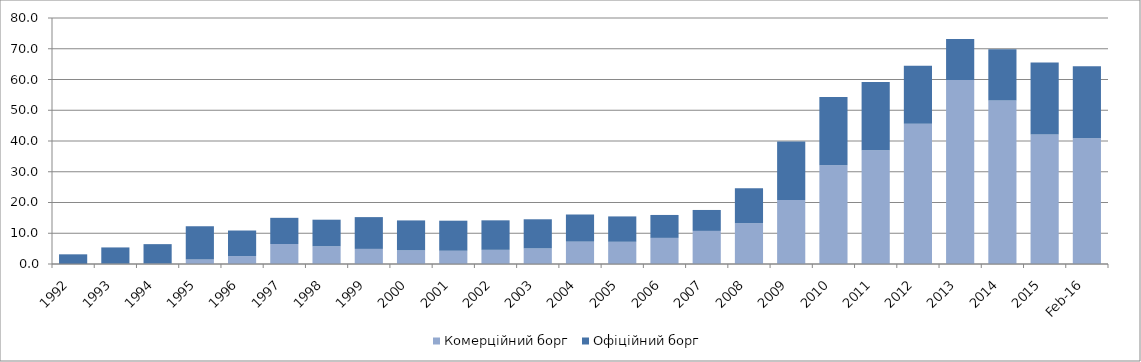
| Category | Комерційний борг | Офіційний борг |
|---|---|---|
| 1992.0 | 0.002 | 3.145 |
| 1993.0 | 0.093 | 5.294 |
| 1994.0 | 0.141 | 6.319 |
| 1995.0 | 1.452 | 10.845 |
| 1996.0 | 2.584 | 8.306 |
| 1997.0 | 6.501 | 8.515 |
| 1998.0 | 5.762 | 8.647 |
| 1999.0 | 4.91 | 10.338 |
| 2000.0 | 4.437 | 9.735 |
| 2001.0 | 4.31 | 9.775 |
| 2002.0 | 4.609 | 9.593 |
| 2003.0 | 5.066 | 9.477 |
| 2004.0 | 7.274 | 8.823 |
| 2005.0 | 7.225 | 8.249 |
| 2006.0 | 8.489 | 7.461 |
| 2007.0 | 10.762 | 6.811 |
| 2008.0 | 13.215 | 11.384 |
| 2009.0 | 20.831 | 18.982 |
| 2010.0 | 32.087 | 22.211 |
| 2011.0 | 37.025 | 22.198 |
| 2012.0 | 45.621 | 18.875 |
| 2013.0 | 59.842 | 13.321 |
| 2014.0 | 53.19 | 16.622 |
| 2015.0 | 42.095 | 23.41 |
| 42429.0 | 40.856 | 23.493 |